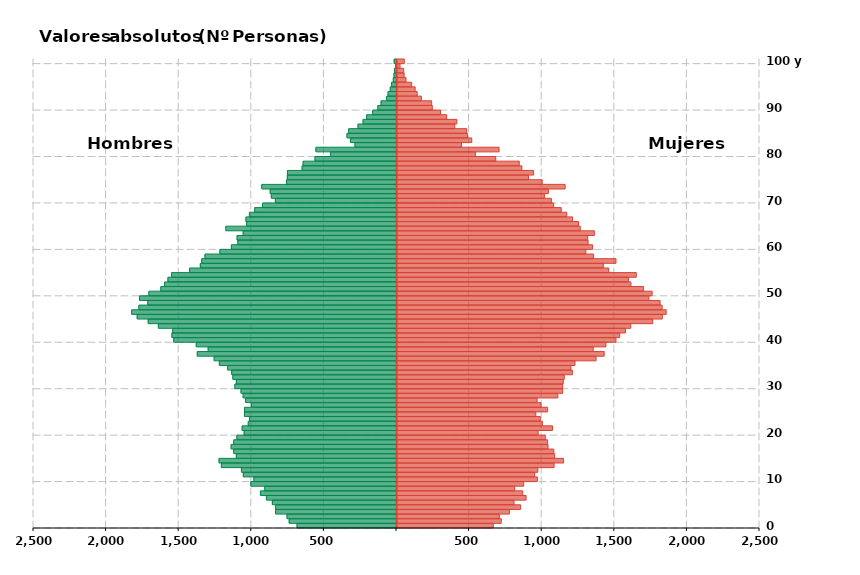
| Category | Hombres | Mujeres |
|---|---|---|
| 0 | -685 | 663 |
| 1 | -739 | 718 |
| 2 | -754 | 705 |
| 3 | -833 | 774 |
| 4 | -832 | 851 |
| 5 | -855 | 806 |
| 6 | -896 | 889 |
| 7 | -937 | 866 |
| 8 | -907 | 811 |
| 9 | -1003 | 872 |
| 10 | -982 | 967 |
| 11 | -1055 | 948 |
| 12 | -1068 | 970 |
| 13 | -1206 | 1082 |
| 14 | -1222 | 1147 |
| 15 | -1103 | 1086 |
| 16 | -1121 | 1080 |
| 17 | -1139 | 1040 |
| 18 | -1121 | 1037 |
| 19 | -1099 | 1021 |
| 20 | -1049 | 972 |
| 21 | -1063 | 1071 |
| 22 | -1021 | 1001 |
| 23 | -1012 | 987 |
| 24 | -1047 | 956 |
| 25 | -1046 | 1037 |
| 26 | -999 | 992 |
| 27 | -1039 | 965 |
| 28 | -1056 | 1108 |
| 29 | -1071 | 1141 |
| 30 | -1113 | 1141 |
| 31 | -1103 | 1145 |
| 32 | -1127 | 1152 |
| 33 | -1135 | 1208 |
| 34 | -1163 | 1198 |
| 35 | -1220 | 1226 |
| 36 | -1256 | 1371 |
| 37 | -1372 | 1427 |
| 38 | -1297 | 1351 |
| 39 | -1379 | 1439 |
| 40 | -1534 | 1508 |
| 41 | -1547 | 1534 |
| 42 | -1541 | 1574 |
| 43 | -1640 | 1610 |
| 44 | -1710 | 1761 |
| 45 | -1786 | 1827 |
| 46 | -1824 | 1854 |
| 47 | -1774 | 1826 |
| 48 | -1713 | 1812 |
| 49 | -1770 | 1735 |
| 50 | -1705 | 1757 |
| 51 | -1623 | 1698 |
| 52 | -1597 | 1611 |
| 53 | -1574 | 1594 |
| 54 | -1549 | 1648 |
| 55 | -1425 | 1458 |
| 56 | -1351 | 1421 |
| 57 | -1341 | 1508 |
| 58 | -1319 | 1354 |
| 59 | -1216 | 1301 |
| 60 | -1137 | 1347 |
| 61 | -1093 | 1316 |
| 62 | -1098 | 1313 |
| 63 | -1056 | 1359 |
| 64 | -1175 | 1262 |
| 65 | -1032 | 1250 |
| 66 | -1037 | 1209 |
| 67 | -1013 | 1169 |
| 68 | -977 | 1131 |
| 69 | -923 | 1079 |
| 70 | -834 | 1063 |
| 71 | -862 | 1015 |
| 72 | -870 | 1042 |
| 73 | -928 | 1158 |
| 74 | -757 | 1000 |
| 75 | -752 | 906 |
| 76 | -751 | 941 |
| 77 | -650 | 860 |
| 78 | -643 | 842 |
| 79 | -561 | 680 |
| 80 | -454 | 540 |
| 81 | -555 | 703 |
| 82 | -286 | 444 |
| 83 | -317 | 515 |
| 84 | -341 | 485 |
| 85 | -329 | 480 |
| 86 | -265 | 398 |
| 87 | -230 | 412 |
| 88 | -206 | 342 |
| 89 | -165 | 300 |
| 90 | -128 | 243 |
| 91 | -106 | 239 |
| 92 | -68 | 168 |
| 93 | -58 | 139 |
| 94 | -43 | 125 |
| 95 | -34 | 101 |
| 96 | -22 | 62 |
| 97 | -17 | 49 |
| 98 | -14 | 46 |
| 99 | -5 | 21 |
| 100 | -16 | 50 |